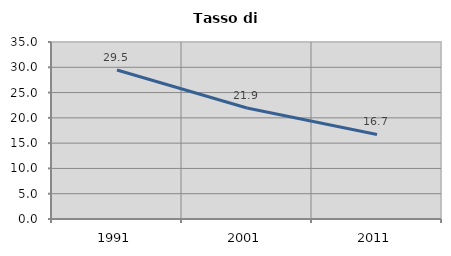
| Category | Tasso di disoccupazione   |
|---|---|
| 1991.0 | 29.462 |
| 2001.0 | 21.938 |
| 2011.0 | 16.727 |